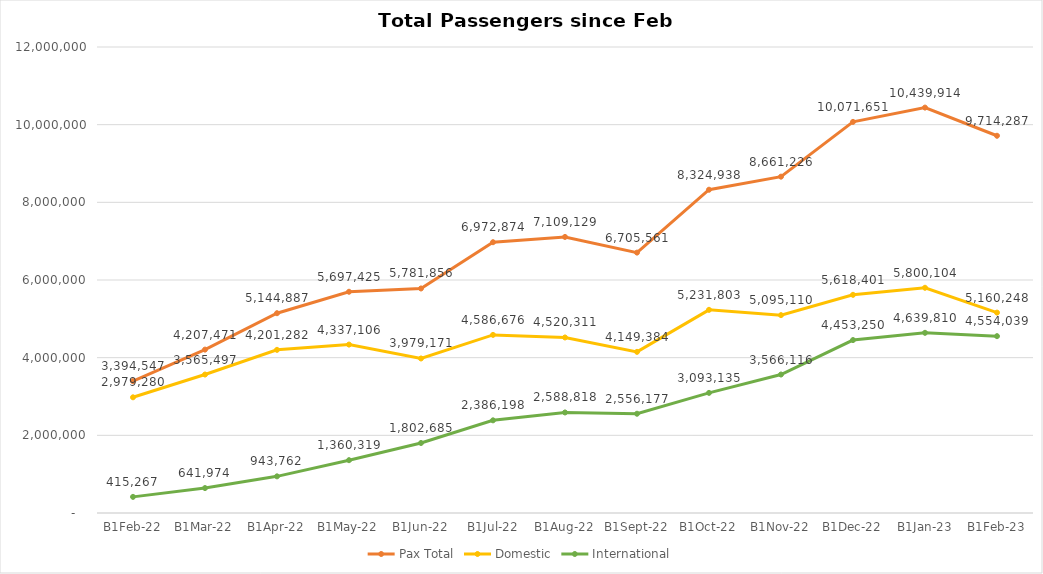
| Category | Pax Total |  Domestic  |  International  |
|---|---|---|---|
| 2022-02-01 | 3394547 | 2979280 | 415267 |
| 2022-03-01 | 4207471 | 3565497 | 641974 |
| 2022-04-01 | 5144887 | 4201282 | 943762 |
| 2022-05-01 | 5697425 | 4337106 | 1360319 |
| 2022-06-01 | 5781856 | 3979171 | 1802685 |
| 2022-07-01 | 6972874 | 4586676 | 2386198 |
| 2022-08-01 | 7109129 | 4520311 | 2588818 |
| 2022-09-01 | 6705561 | 4149384 | 2556177 |
| 2022-10-01 | 8324938 | 5231803 | 3093135 |
| 2022-11-01 | 8661226 | 5095110 | 3566116 |
| 2022-12-01 | 10071651 | 5618401 | 4453250 |
| 2023-01-01 | 10439914 | 5800104 | 4639810 |
| 2023-02-01 | 9714287 | 5160248 | 4554039 |